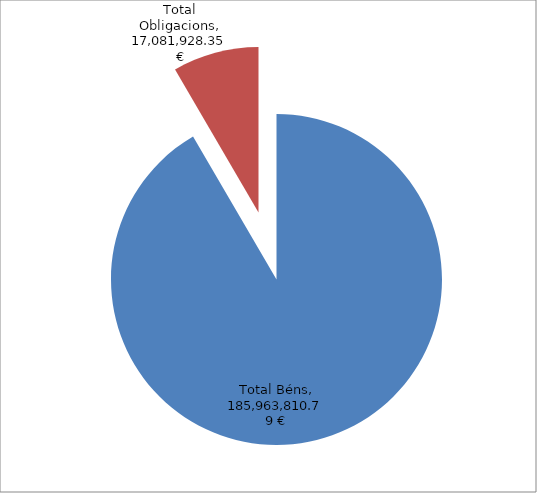
| Category | Series 0 |
|---|---|
| Total Béns | 185963810.79 |
| Total Obligacions | 17081928.35 |